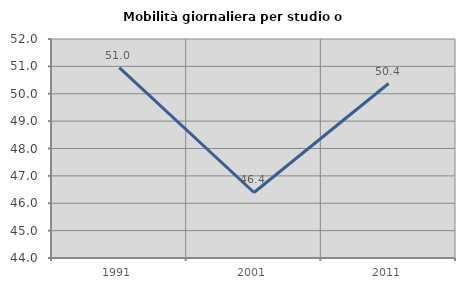
| Category | Mobilità giornaliera per studio o lavoro |
|---|---|
| 1991.0 | 50.955 |
| 2001.0 | 46.393 |
| 2011.0 | 50.373 |